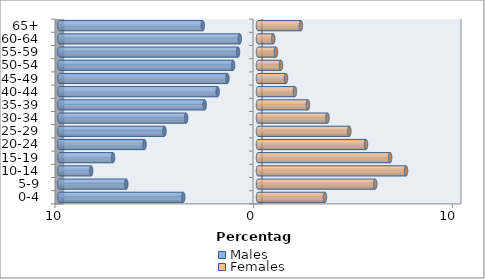
| Category | Males | Females |
|---|---|---|
| 0-4 | -3.765 | 3.371 |
| 5-9 | -6.629 | 5.899 |
| 10-14 | -8.399 | 7.45 |
| 15-19 | -7.297 | 6.651 |
| 20-24 | -5.713 | 5.435 |
| 25-29 | -4.709 | 4.595 |
| 30-34 | -3.617 | 3.495 |
| 35-39 | -2.685 | 2.513 |
| 40-44 | -2.032 | 1.857 |
| 45-49 | -1.541 | 1.408 |
| 50-54 | -1.254 | 1.155 |
| 55-59 | -1.006 | 0.904 |
| 60-64 | -0.917 | 0.767 |
| 65+ | -2.779 | 2.158 |